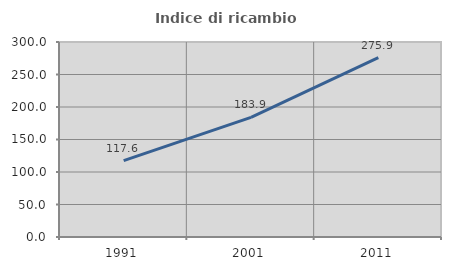
| Category | Indice di ricambio occupazionale  |
|---|---|
| 1991.0 | 117.593 |
| 2001.0 | 183.942 |
| 2011.0 | 275.942 |